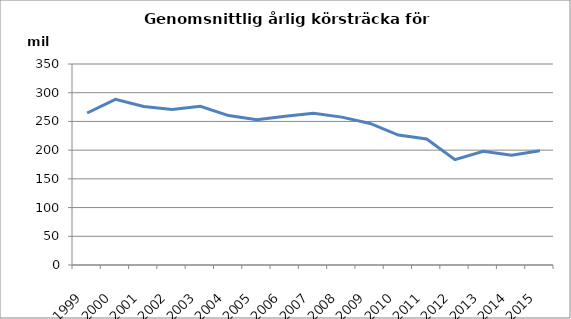
| Category | Series 0 |
|---|---|
| 1999.0 | 264.709 |
| 2000.0 | 288.43 |
| 2001.0 | 276.111 |
| 2002.0 | 270.644 |
| 2003.0 | 276.316 |
| 2004.0 | 260.212 |
| 2005.0 | 253.081 |
| 2006.0 | 258.824 |
| 2007.0 | 264.121 |
| 2008.0 | 257.478 |
| 2009.0 | 246.424 |
| 2010.0 | 226.301 |
| 2011.0 | 219.472 |
| 2012.0 | 183.491 |
| 2013.0 | 198.089 |
| 2014.0 | 191 |
| 2015.0 | 199 |